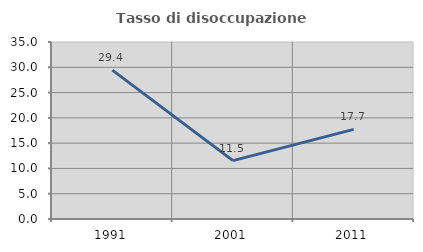
| Category | Tasso di disoccupazione giovanile  |
|---|---|
| 1991.0 | 29.448 |
| 2001.0 | 11.538 |
| 2011.0 | 17.73 |